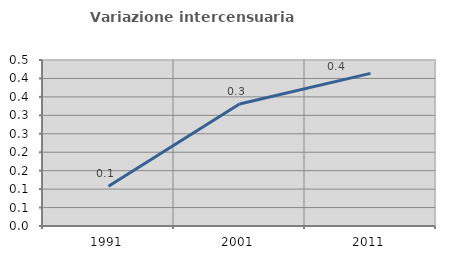
| Category | Variazione intercensuaria annua |
|---|---|
| 1991.0 | 0.108 |
| 2001.0 | 0.331 |
| 2011.0 | 0.414 |